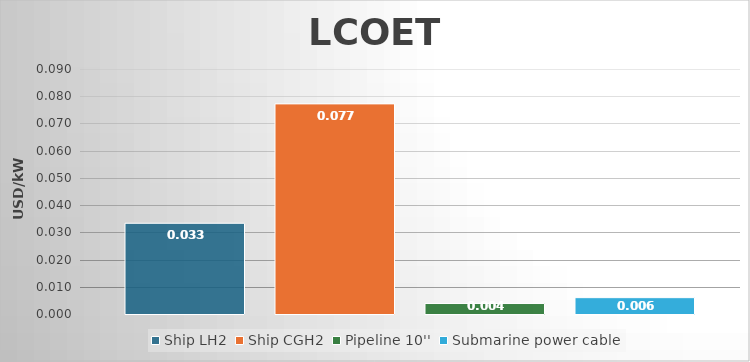
| Category | Ship LH2 | Ship CGH2 | Pipeline 10'' | Submarine power cable |
|---|---|---|---|---|
| 0 | 0.033 | 0.077 | 0.004 | 0.006 |